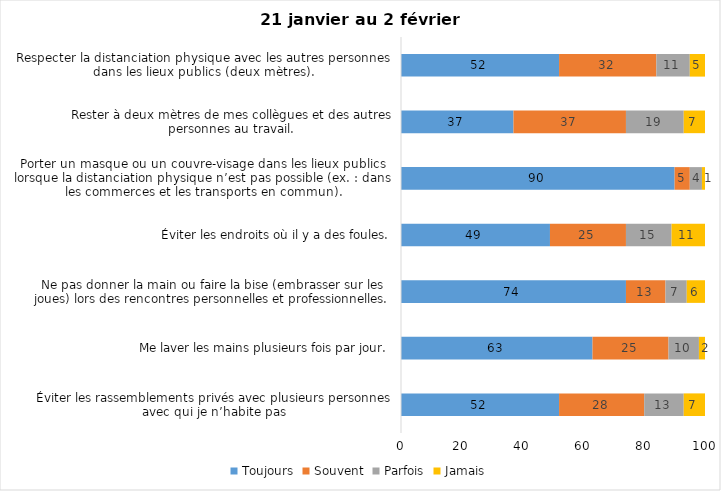
| Category | Toujours | Souvent | Parfois | Jamais |
|---|---|---|---|---|
| Éviter les rassemblements privés avec plusieurs personnes avec qui je n’habite pas | 52 | 28 | 13 | 7 |
| Me laver les mains plusieurs fois par jour. | 63 | 25 | 10 | 2 |
| Ne pas donner la main ou faire la bise (embrasser sur les joues) lors des rencontres personnelles et professionnelles. | 74 | 13 | 7 | 6 |
| Éviter les endroits où il y a des foules. | 49 | 25 | 15 | 11 |
| Porter un masque ou un couvre-visage dans les lieux publics lorsque la distanciation physique n’est pas possible (ex. : dans les commerces et les transports en commun). | 90 | 5 | 4 | 1 |
| Rester à deux mètres de mes collègues et des autres personnes au travail. | 37 | 37 | 19 | 7 |
| Respecter la distanciation physique avec les autres personnes dans les lieux publics (deux mètres). | 52 | 32 | 11 | 5 |